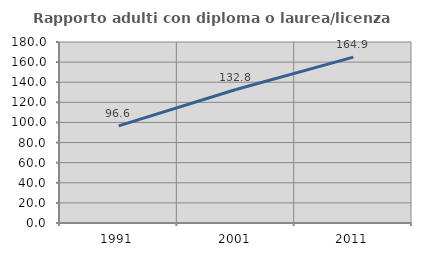
| Category | Rapporto adulti con diploma o laurea/licenza media  |
|---|---|
| 1991.0 | 96.607 |
| 2001.0 | 132.76 |
| 2011.0 | 164.935 |